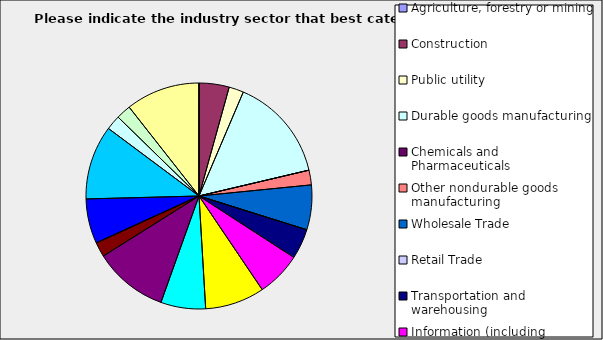
| Category | Series 0 |
|---|---|
| Agriculture, forestry or mining | 0 |
| Construction | 0.043 |
| Public utility | 0.021 |
| Durable goods manufacturing | 0.149 |
| Chemicals and Pharmaceuticals | 0 |
| Other nondurable goods manufacturing | 0.021 |
| Wholesale Trade | 0.064 |
| Retail Trade | 0 |
| Transportation and warehousing | 0.043 |
| Information (including broadcasting and telecommunication) | 0.064 |
| Finance and Insurance | 0.085 |
| Real Estate | 0.064 |
| Professional, scientific and technical services | 0.106 |
| Consulting | 0.021 |
| Administrative and office services (including waste management) | 0 |
| Education | 0.064 |
| Health Care and social services | 0.106 |
| Arts, entertainment and recreation | 0.021 |
| Accommodation and food services | 0.021 |
| Other | 0.106 |